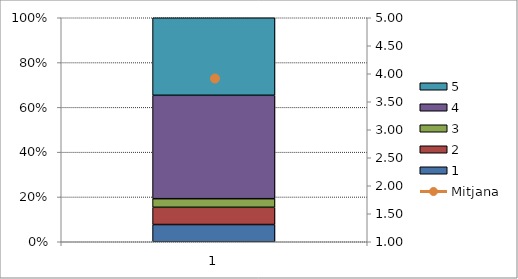
| Category | 1 | 2 | 3 | 4 | 5 |
|---|---|---|---|---|---|
| 0 | 2 | 2 | 1 | 12 | 9 |